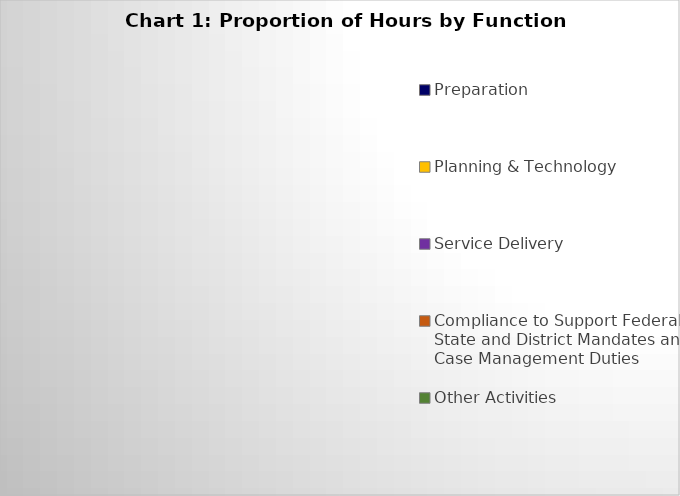
| Category | Series 0 |
|---|---|
| Preparation | 0 |
| Planning & Technology | 0 |
| Service Delivery | 0 |
| Compliance to Support Federal, State and District Mandates and Case Management Duties | 0 |
| Other Activities | 0 |